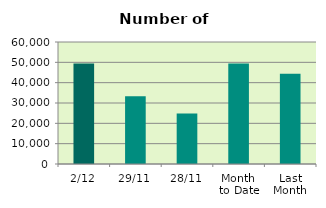
| Category | Series 0 |
|---|---|
| 2/12 | 49476 |
| 29/11 | 33308 |
| 28/11 | 24822 |
| Month 
to Date | 49476 |
| Last
Month | 44331.238 |